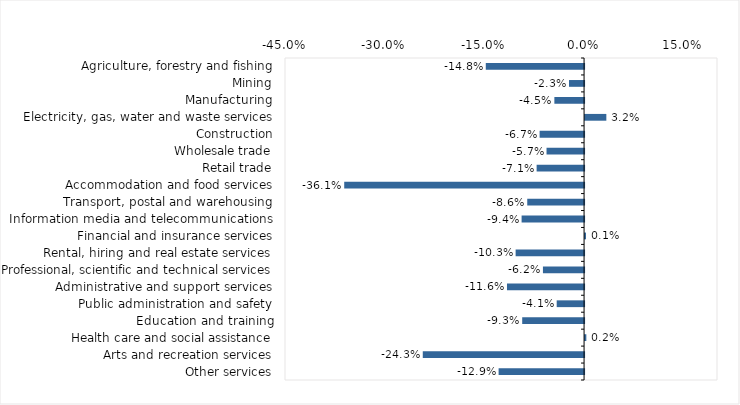
| Category | This week |
|---|---|
| Agriculture, forestry and fishing | -0.148 |
| Mining | -0.023 |
| Manufacturing | -0.045 |
| Electricity, gas, water and waste services | 0.032 |
| Construction | -0.067 |
| Wholesale trade | -0.056 |
| Retail trade | -0.071 |
| Accommodation and food services | -0.361 |
| Transport, postal and warehousing | -0.086 |
| Information media and telecommunications | -0.094 |
| Financial and insurance services | 0.001 |
| Rental, hiring and real estate services | -0.103 |
| Professional, scientific and technical services | -0.062 |
| Administrative and support services | -0.116 |
| Public administration and safety | -0.041 |
| Education and training | -0.093 |
| Health care and social assistance | 0.002 |
| Arts and recreation services | -0.243 |
| Other services | -0.129 |